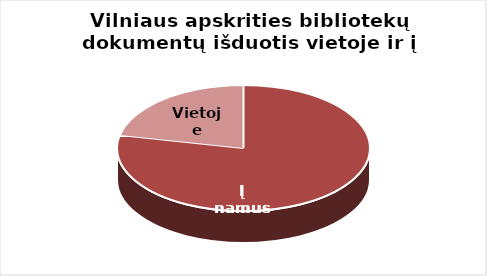
| Category | Series 0 |
|---|---|
| Į namus | 1238594 |
| Vietoje | 342745 |